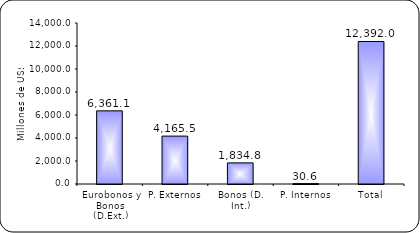
| Category | Series 1 |
|---|---|
| Eurobonos y Bonos (D.Ext.) | 6361.1 |
| P. Externos | 4165.5 |
| Bonos (D. Int.) | 1834.8 |
| P. Internos | 30.6 |
| Total | 12392 |